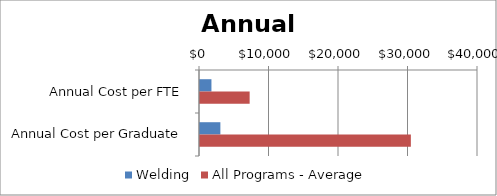
| Category | Welding | All Programs - Average |
|---|---|---|
| Annual Cost per FTE | 1646.93 | 7144 |
| Annual Cost per Graduate | 2931.536 | 30340 |